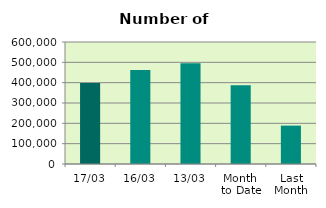
| Category | Series 0 |
|---|---|
| 17/03 | 398808 |
| 16/03 | 461836 |
| 13/03 | 495640 |
| Month 
to Date | 387517.333 |
| Last
Month | 188783.7 |